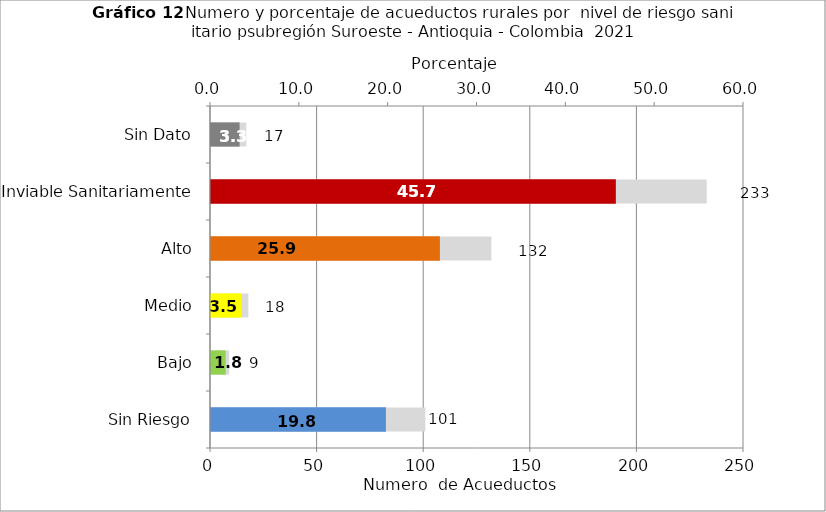
| Category | Número de Sistemas |
|---|---|
| Sin Riesgo | 101 |
| Bajo | 9 |
| Medio | 18 |
| Alto | 132 |
| Inviable Sanitariamente | 233 |
| Sin Dato | 17 |